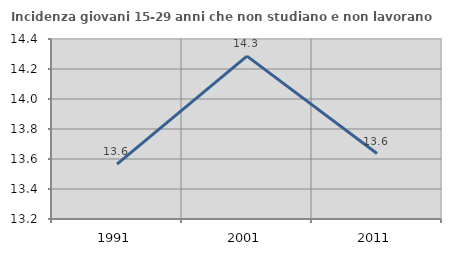
| Category | Incidenza giovani 15-29 anni che non studiano e non lavorano  |
|---|---|
| 1991.0 | 13.566 |
| 2001.0 | 14.286 |
| 2011.0 | 13.636 |